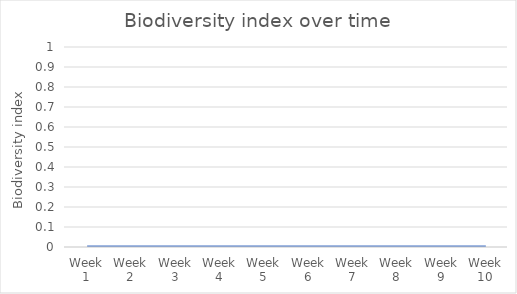
| Category | Series 0 |
|---|---|
| Week 1 | 0 |
| Week 2 | 0 |
| Week 3 | 0 |
| Week 4 | 0 |
| Week 5 | 0 |
| Week 6 | 0 |
| Week 7 | 0 |
| Week 8 | 0 |
| Week 9 | 0 |
| Week 10 | 0 |